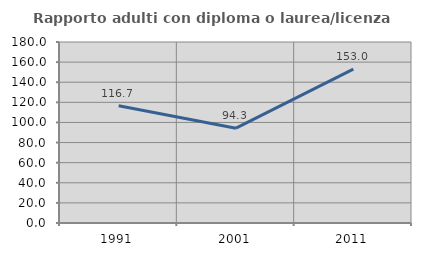
| Category | Rapporto adulti con diploma o laurea/licenza media  |
|---|---|
| 1991.0 | 116.667 |
| 2001.0 | 94.309 |
| 2011.0 | 153.043 |